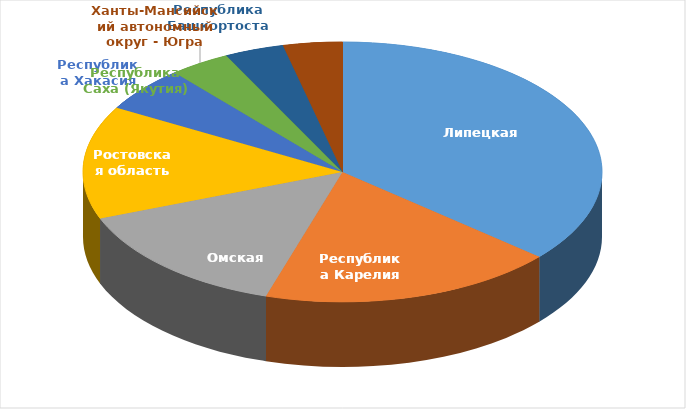
| Category | Series 0 |
|---|---|
| Липецкая область | 305 |
| Республика Карелия | 155 |
| Омская область | 121 |
| Ростовская область | 118 |
| Республика Хакасия | 47 |
| Республика Саха (Якутия) | 32 |
| Республика Башкортостан | 31 |
| Ханты-Мансийский автономный округ - Югра | 31 |